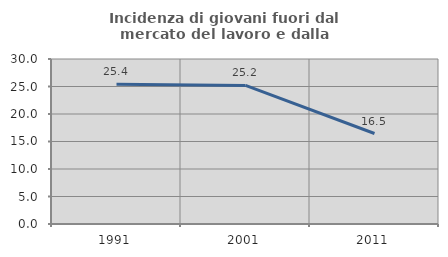
| Category | Incidenza di giovani fuori dal mercato del lavoro e dalla formazione  |
|---|---|
| 1991.0 | 25.407 |
| 2001.0 | 25.198 |
| 2011.0 | 16.454 |